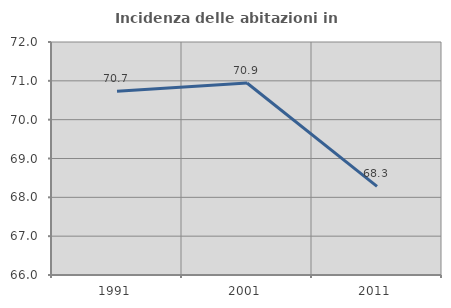
| Category | Incidenza delle abitazioni in proprietà  |
|---|---|
| 1991.0 | 70.729 |
| 2001.0 | 70.945 |
| 2011.0 | 68.282 |